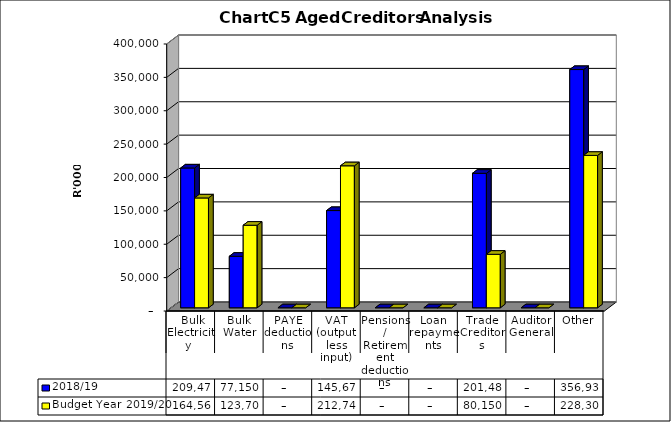
| Category | 2018/19 | Budget Year 2019/20 |
|---|---|---|
|  Bulk Electricity  | 209470837 | 164560536.95 |
| Bulk Water | 77149902 | 123702041.89 |
| PAYE deductions | 0 | 0 |
| VAT (output less input) | 145670375 | 212743550.15 |
| Pensions / Retirement deductions | 0 | 0 |
| Loan repayments | 0 | 0 |
| Trade Creditors | 201489432 | 80150338.99 |
| Auditor General | 0 | 0 |
| Other | 356936386 | 228302380.55 |